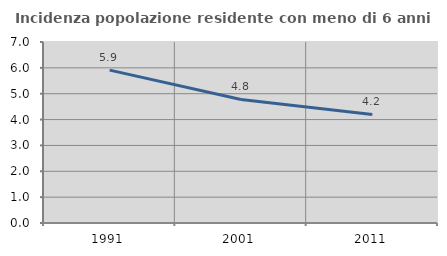
| Category | Incidenza popolazione residente con meno di 6 anni |
|---|---|
| 1991.0 | 5.911 |
| 2001.0 | 4.779 |
| 2011.0 | 4.199 |